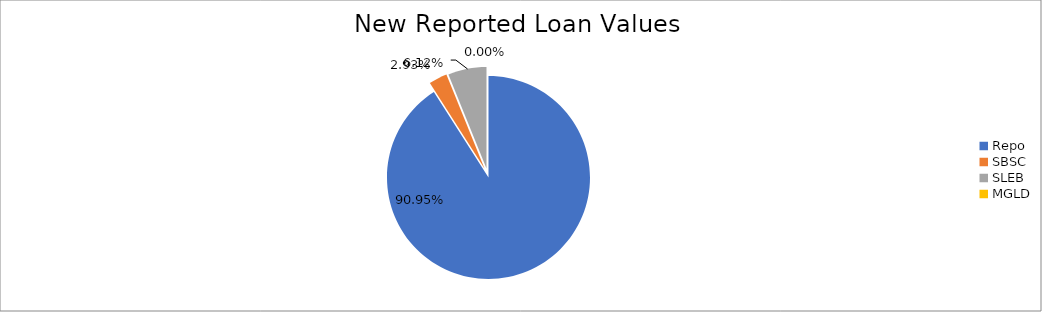
| Category | Series 0 |
|---|---|
| Repo | 9100856.177 |
| SBSC | 293057.022 |
| SLEB | 612214.903 |
| MGLD | 216.024 |